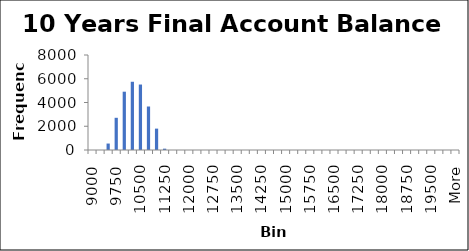
| Category | Frequency |
|---|---|
| 9000.0 | 0 |
| 9250.0 | 0 |
| 9500.0 | 544 |
| 9750.0 | 2712 |
| 10000.0 | 4910 |
| 10250.0 | 5746 |
| 10500.0 | 5513 |
| 10750.0 | 3663 |
| 11000.0 | 1800 |
| 11250.0 | 112 |
| 11500.0 | 0 |
| 11750.0 | 0 |
| 12000.0 | 0 |
| 12250.0 | 0 |
| 12500.0 | 0 |
| 12750.0 | 0 |
| 13000.0 | 0 |
| 13250.0 | 0 |
| 13500.0 | 0 |
| 13750.0 | 0 |
| 14000.0 | 0 |
| 14250.0 | 0 |
| 14500.0 | 0 |
| 14750.0 | 0 |
| 15000.0 | 0 |
| 15250.0 | 0 |
| 15500.0 | 0 |
| 15750.0 | 0 |
| 16000.0 | 0 |
| 16250.0 | 0 |
| 16500.0 | 0 |
| 16750.0 | 0 |
| 17000.0 | 0 |
| 17250.0 | 0 |
| 17500.0 | 0 |
| 17750.0 | 0 |
| 18000.0 | 0 |
| 18250.0 | 0 |
| 18500.0 | 0 |
| 18750.0 | 0 |
| 19000.0 | 0 |
| 19250.0 | 0 |
| 19500.0 | 0 |
| 19750.0 | 0 |
| 20000.0 | 0 |
| More | 0 |